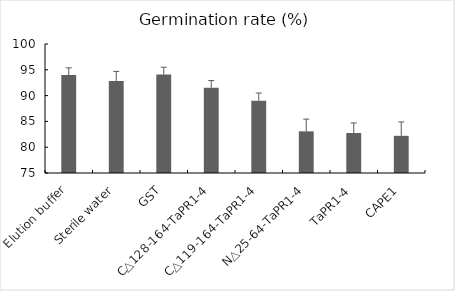
| Category | 93.9832 |
|---|---|
| Elution buffer | 93.983 |
| Sterile water | 92.841 |
| GST | 94.077 |
| C△128-164-TaPR1-4 | 91.526 |
| C△119-164-TaPR1-4 | 89.008 |
| N△25-64-TaPR1-4 | 83.074 |
| TaPR1-4 | 82.752 |
| CAPE1 | 82.205 |